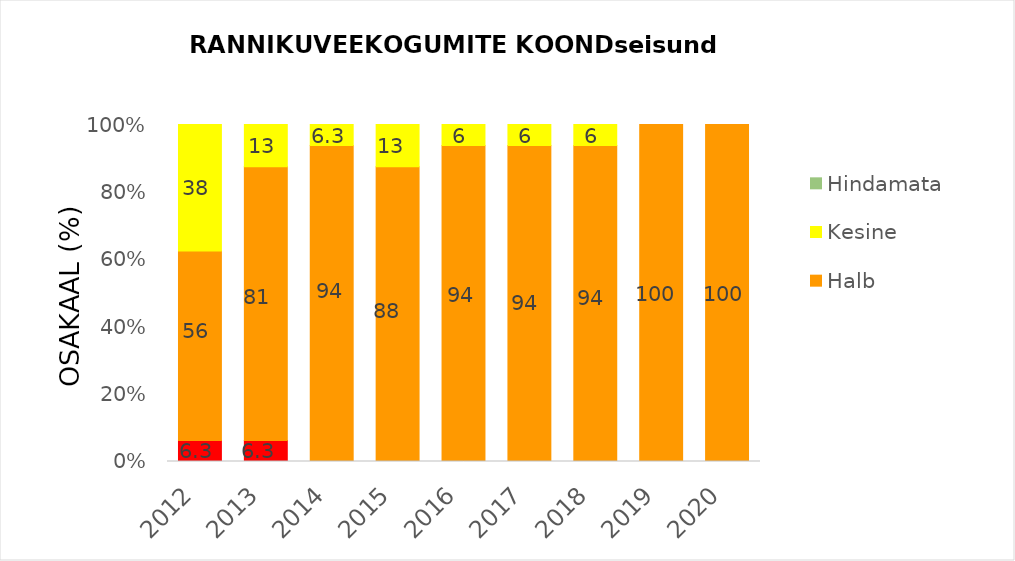
| Category | Väga halb | Halb | Kesine | Hindamata |
|---|---|---|---|---|
| 2012.0 | 6.25 | 56.25 | 37.5 | 0 |
| 2013.0 | 6.25 | 81.25 | 12.5 | 0 |
| 2014.0 | 0 | 93.75 | 6.25 | 0 |
| 2015.0 | 0 | 87.5 | 12.5 | 0 |
| 2016.0 | 0 | 93.75 | 6.25 | 0 |
| 2017.0 | 0 | 93.75 | 6.25 | 0 |
| 2018.0 | 0 | 93.75 | 6.25 | 0 |
| 2019.0 | 0 | 100 | 0 | 0 |
| 2020.0 | 0 | 100 | 0 | 0 |